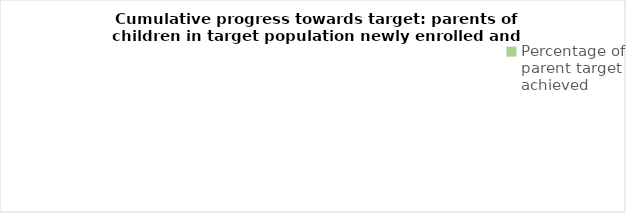
| Category | Series 0 |
|---|---|
| Percentage of parent target achieved | 0 |
| Remaining progress needed | 0 |